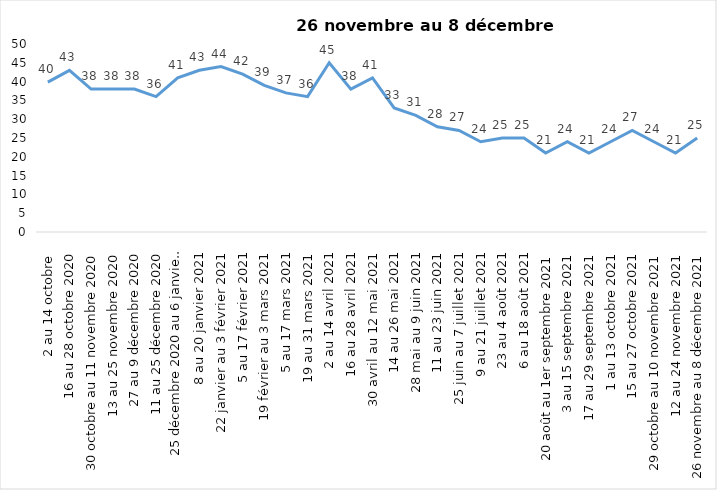
| Category | Toujours aux trois mesures |
|---|---|
| 2 au 14 octobre  | 39.85 |
| 16 au 28 octobre 2020 | 43 |
| 30 octobre au 11 novembre 2020 | 38 |
| 13 au 25 novembre 2020 | 38 |
| 27 au 9 décembre 2020 | 38 |
| 11 au 25 décembre 2020 | 36 |
| 25 décembre 2020 au 6 janvier 2021 | 41 |
| 8 au 20 janvier 2021 | 43 |
| 22 janvier au 3 février 2021 | 44 |
| 5 au 17 février 2021 | 42 |
| 19 février au 3 mars 2021 | 39 |
| 5 au 17 mars 2021 | 37 |
| 19 au 31 mars 2021 | 36 |
| 2 au 14 avril 2021 | 45 |
| 16 au 28 avril 2021 | 38 |
| 30 avril au 12 mai 2021 | 41 |
| 14 au 26 mai 2021 | 33 |
| 28 mai au 9 juin 2021 | 31 |
| 11 au 23 juin 2021 | 28 |
| 25 juin au 7 juillet 2021 | 27 |
| 9 au 21 juillet 2021 | 24 |
| 23 au 4 août 2021 | 25 |
| 6 au 18 août 2021 | 25 |
| 20 août au 1er septembre 2021 | 21 |
| 3 au 15 septembre 2021 | 24 |
| 17 au 29 septembre 2021 | 21 |
| 1 au 13 octobre 2021 | 24 |
| 15 au 27 octobre 2021 | 27 |
| 29 octobre au 10 novembre 2021 | 24 |
| 12 au 24 novembre 2021 | 21 |
| 26 novembre au 8 décembre 2021 | 25 |